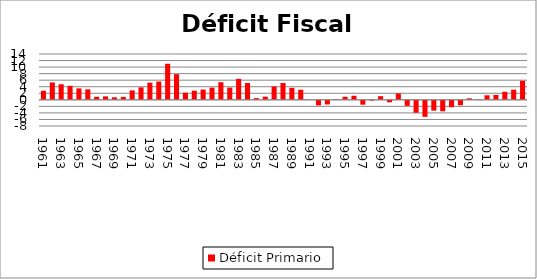
| Category | Déficit Primario |
|---|---|
| 1961.0 | 2.77 |
| 1962.0 | 5.3 |
| 1963.0 | 4.76 |
| 1964.0 | 4.27 |
| 1965.0 | 3.5 |
| 1966.0 | 3.2 |
| 1967.0 | 0.92 |
| 1968.0 | 1.05 |
| 1969.0 | 0.78 |
| 1970.0 | 0.89 |
| 1971.0 | 2.87 |
| 1972.0 | 3.81 |
| 1973.0 | 5.23 |
| 1974.0 | 5.58 |
| 1975.0 | 11.02 |
| 1976.0 | 7.83 |
| 1977.0 | 2.18 |
| 1978.0 | 2.79 |
| 1979.0 | 3.14 |
| 1980.0 | 3.72 |
| 1981.0 | 5.37 |
| 1982.0 | 3.73 |
| 1983.0 | 6.41 |
| 1984.0 | 5.12 |
| 1985.0 | 0.52 |
| 1986.0 | 0.97 |
| 1987.0 | 4.08 |
| 1988.0 | 5.15 |
| 1989.0 | 3.66 |
| 1990.0 | 3.08 |
| 1991.0 | -0.03 |
| 1992.0 | -1.69 |
| 1993.0 | -1.42 |
| 1994.0 | 0.17 |
| 1995.0 | 0.93 |
| 1996.0 | 1.24 |
| 1997.0 | -1.49 |
| 1998.0 | -0.22 |
| 1999.0 | 1.11 |
| 2000.0 | -0.76 |
| 2001.0 | 1.96 |
| 2002.0 | -1.84 |
| 2003.0 | -3.96 |
| 2004.0 | -5.2 |
| 2005.0 | -3.31 |
| 2006.0 | -3.51 |
| 2007.0 | -2.258 |
| 2008.0 | -1.66 |
| 2009.0 | 0.459 |
| 2010.0 | -0.079 |
| 2011.0 | 1.387 |
| 2012.0 | 1.483 |
| 2013.0 | 2.468 |
| 2014.0 | 3.099 |
| 2015.0 | 5.827 |